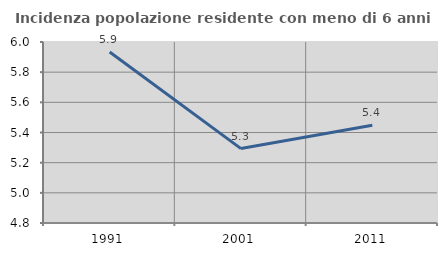
| Category | Incidenza popolazione residente con meno di 6 anni |
|---|---|
| 1991.0 | 5.934 |
| 2001.0 | 5.293 |
| 2011.0 | 5.448 |